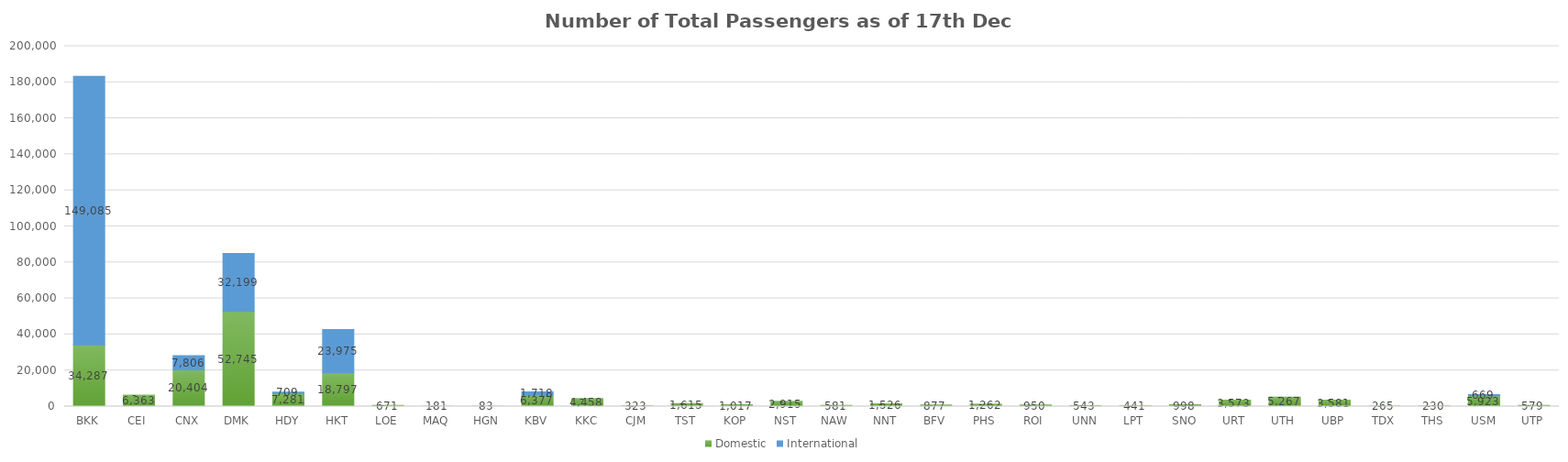
| Category | Domestic | International |
|---|---|---|
| BKK | 34287 | 149085 |
| CEI | 6363 | 0 |
| CNX | 20404 | 7806 |
| DMK | 52745 | 32199 |
| HDY | 7281 | 709 |
| HKT | 18797 | 23975 |
| LOE | 671 | 0 |
| MAQ | 181 | 0 |
| HGN | 83 | 0 |
| KBV | 6377 | 1718 |
| KKC | 4458 | 0 |
| CJM | 323 | 0 |
| TST | 1615 | 0 |
| KOP | 1017 | 0 |
| NST | 2915 | 0 |
| NAW | 581 | 0 |
| NNT | 1526 | 0 |
| BFV | 877 | 0 |
| PHS | 1262 | 0 |
| ROI | 950 | 0 |
| UNN | 543 | 0 |
| LPT | 441 | 0 |
| SNO | 998 | 0 |
| URT | 3573 | 0 |
| UTH | 5267 | 0 |
| UBP | 3581 | 0 |
| TDX | 265 | 0 |
| THS | 230 | 0 |
| USM | 5923 | 669 |
| UTP | 579 | 0 |